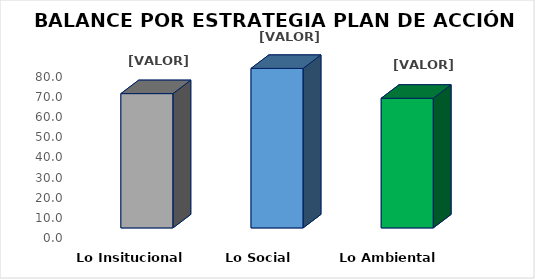
| Category | Series 0 |
|---|---|
| Lo Insitucional | 66.6 |
| Lo Social  | 79.1 |
| Lo Ambiental  | 64.3 |